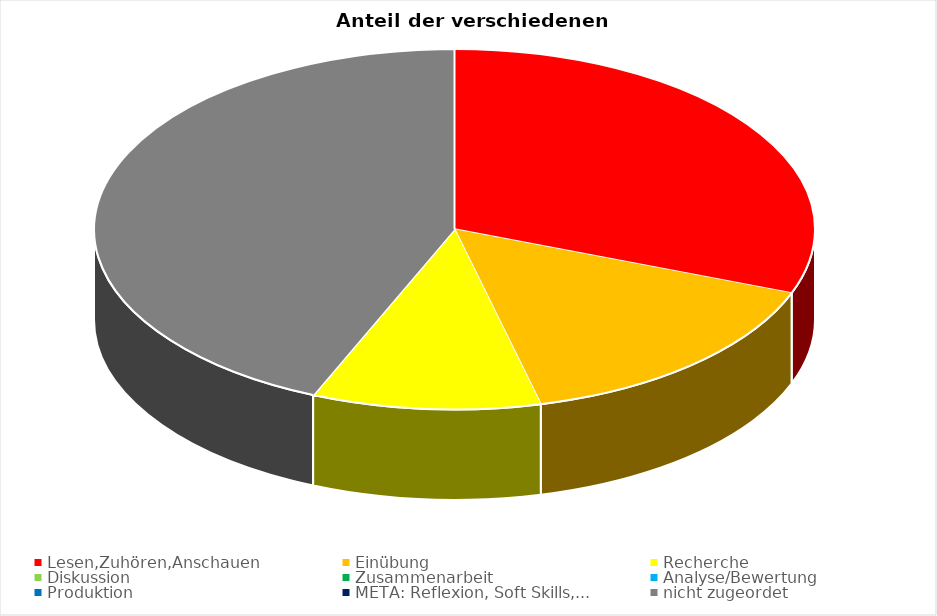
| Category | Series 0 |
|---|---|
| Lesen,Zuhören,Anschauen | 12 |
| Einübung | 6 |
| Recherche | 4 |
| Diskussion | 0 |
| Zusammenarbeit | 0 |
| Analyse/Bewertung | 0 |
| Produktion | 0 |
| META: Reflexion, Soft Skills,... | 0 |
| nicht zugeordet | 17 |